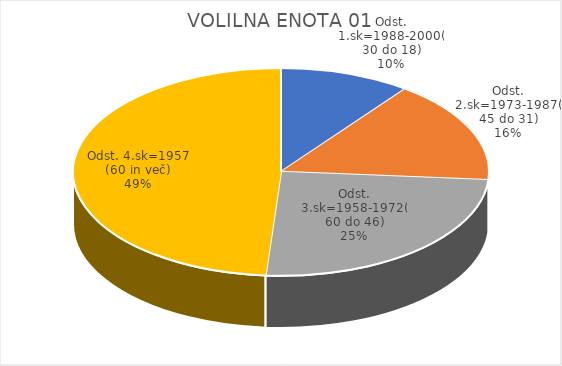
| Category | VOLILNA ENOTA 01 |
|---|---|
| Odst. 1.sk=1988-2000(30 do 18) | 3.09 |
| Odst. 2.sk=1973-1987(45 do 31) | 4.85 |
| Odst. 3.sk=1958-1972(60 do 46) | 7.53 |
| Odst. 4.sk=1957 (60 in več) | 14.76 |